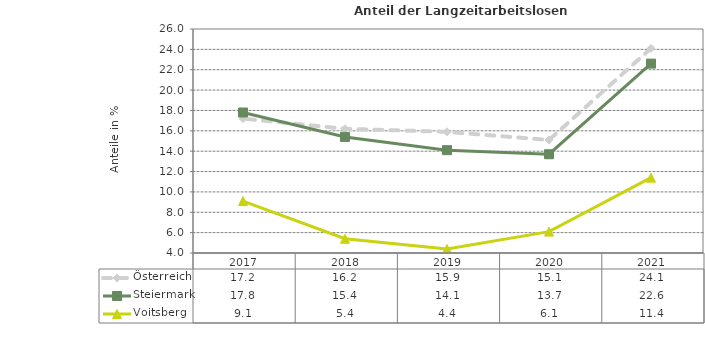
| Category | Österreich | Steiermark | Voitsberg |
|---|---|---|---|
| 2021.0 | 24.1 | 22.6 | 11.4 |
| 2020.0 | 15.1 | 13.7 | 6.1 |
| 2019.0 | 15.9 | 14.1 | 4.4 |
| 2018.0 | 16.2 | 15.4 | 5.4 |
| 2017.0 | 17.2 | 17.8 | 9.1 |